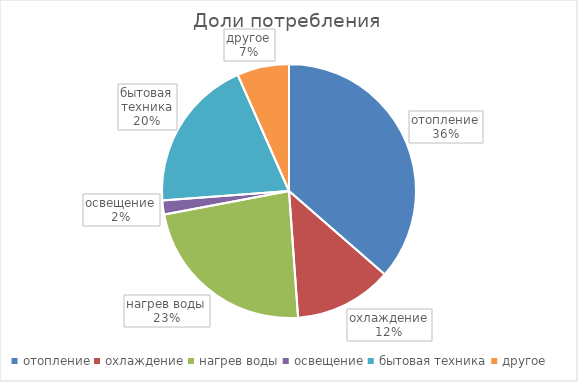
| Category | Series 0 |
|---|---|
| отопление | 2489219.794 |
| охлаждение | 851760 |
| нагрев воды | 1584048.96 |
| освещение | 121680 |
| бытовая техника | 1338480 |
| другое | 452585.417 |